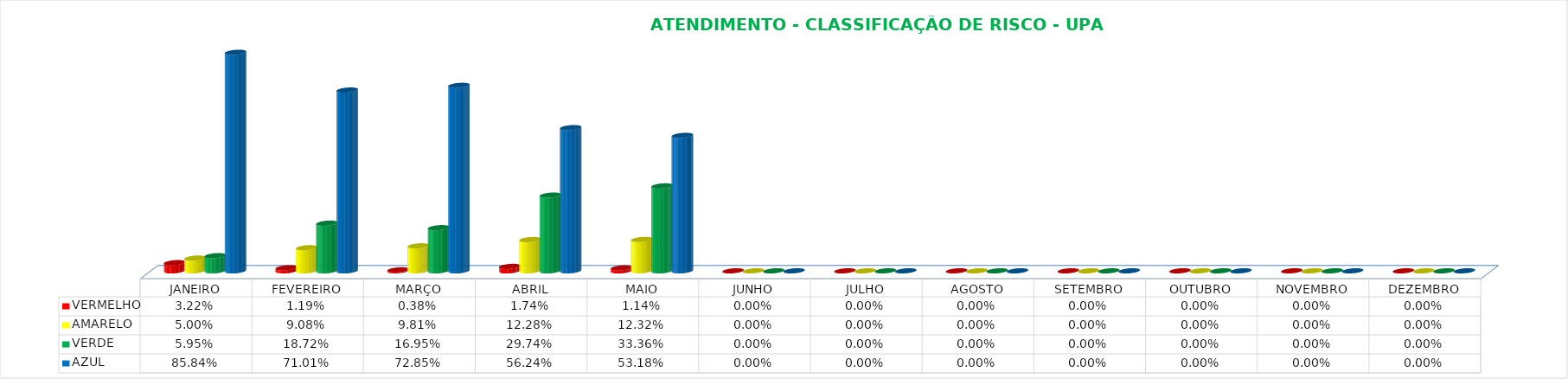
| Category | VERMELHO | AMARELO | VERDE | AZUL |
|---|---|---|---|---|
| JANEIRO | 0.032 | 0.05 | 0.059 | 0.858 |
| FEVEREIRO | 0.012 | 0.091 | 0.187 | 0.71 |
| MARÇO | 0.004 | 0.098 | 0.17 | 0.729 |
| ABRIL | 0.017 | 0.123 | 0.297 | 0.562 |
| MAIO | 0.011 | 0.123 | 0.334 | 0.532 |
| JUNHO | 0 | 0 | 0 | 0 |
| JULHO | 0 | 0 | 0 | 0 |
| AGOSTO | 0 | 0 | 0 | 0 |
| SETEMBRO | 0 | 0 | 0 | 0 |
| OUTUBRO | 0 | 0 | 0 | 0 |
| NOVEMBRO | 0 | 0 | 0 | 0 |
| DEZEMBRO | 0 | 0 | 0 | 0 |